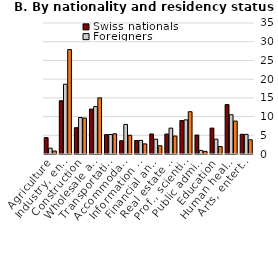
| Category | Swiss nationals | Foreigners | Cross-border workers |
|---|---|---|---|
| Agriculture | 4.375 | 1.561 | 0.8 |
| Industry, energy production | 14.23 | 18.645 | 27.9 |
| Construction | 7.018 | 9.745 | 9.6 |
| Wholesale and retail trade, repair | 12 | 12.675 | 15 |
| Transportation and storage | 5.172 | 5.204 | 5.4 |
| Accommodation and food service | 3.542 | 7.905 | 5 |
| Information and communication | 3.603 | 3.63 | 2.7 |
| Financial and insurance activities | 5.349 | 3.956 | 2.2 |
| Real estate and adm. activities | 5.329 | 6.909 | 4.8 |
| Prof., scientific and tech. activities | 8.93 | 9.12 | 11.3 |
| Public administration | 5.066 | 0.96 | 0.7 |
| Education | 6.92 | 3.962 | 2 |
| Human health and social work | 13.201 | 10.483 | 8.8 |
| Arts, entertain., recreation and other | 5.265 | 5.245 | 3.8 |